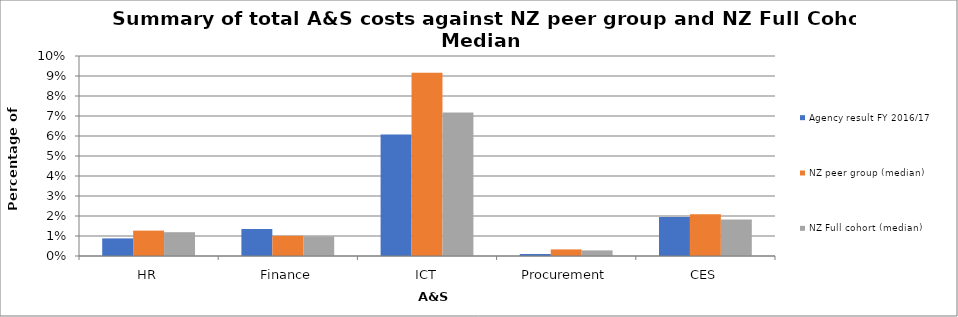
| Category | Agency result FY 2016/17 | NZ peer group (median) | NZ Full cohort (median) |
|---|---|---|---|
| HR | 0.009 | 0.013 | 0.012 |
| Finance | 0.014 | 0.01 | 0.01 |
| ICT | 0.061 | 0.092 | 0.072 |
| Procurement | 0.001 | 0.003 | 0.003 |
| CES | 0.02 | 0.021 | 0.018 |